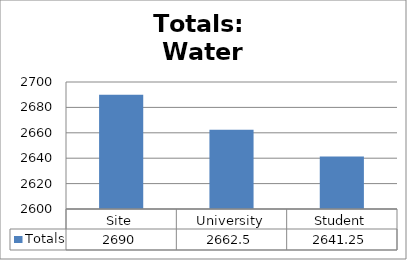
| Category | Totals |
|---|---|
| Site | 2690 |
| University | 2662.5 |
| Student | 2641.25 |